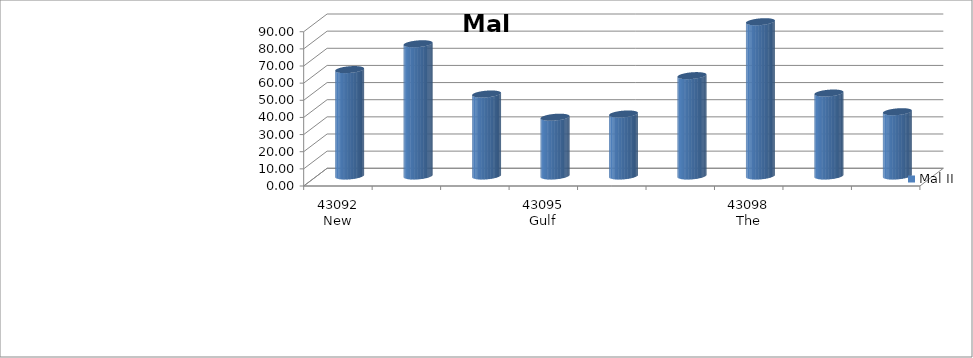
| Category | Mal II |
|---|---|
| 43092 New Indian Model School Dubai UAE | 62.07 |
| 43093 The New Indian Model School Sharjah | 77.14 |
| 43094 New Indian H S S Ras Al Khaimah, U.A.E | 47.83 |
| 43095 Gulf Model School Dubai UAE | 34.29 |
| 43096 The English School, Umm Al Quwain | 36.17 |
| 43097 The Indian School Fujairah UAE | 58.54 |
| 43098 The Model School Abu Dhabi UAE | 90 |
| 43102 New Indian Model School  Al Ain,  UAE | 48.39 |
| 43103 The New Indian School Umm Al Quwain  | 37.5 |